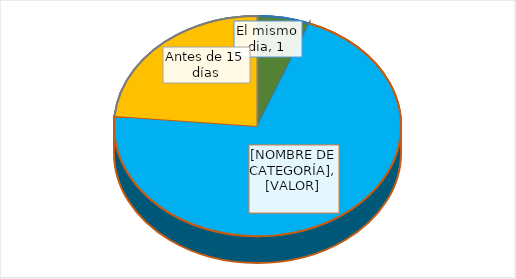
| Category | Series 0 |
|---|---|
| El mismo dia | 1 |
| Antes de 10 días | 12 |
| Antes de 15 días | 4 |